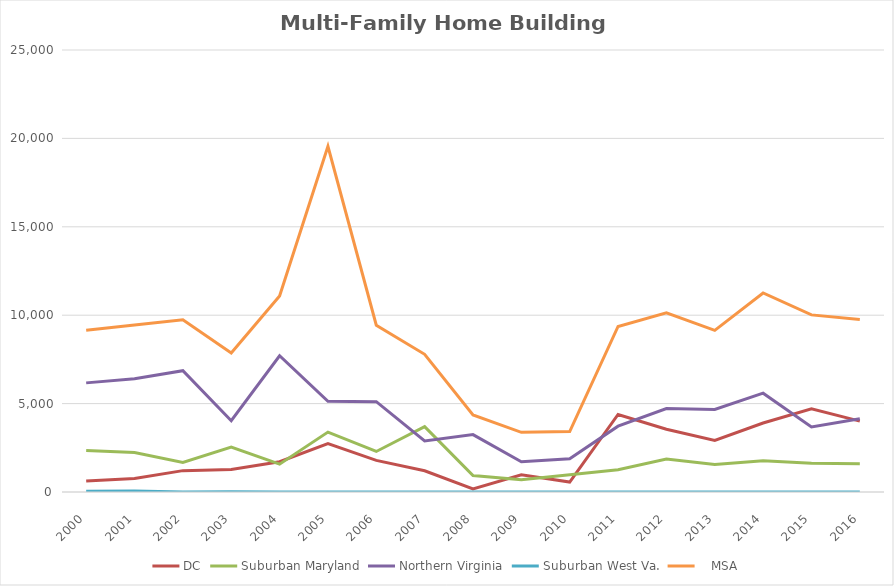
| Category | DC | Suburban Maryland | Northern Virginia | Suburban West Va. |    MSA |
|---|---|---|---|---|---|
| 2000.0 | 619 | 2354 | 6172 | 49 | 9147 |
| 2001.0 | 765 | 2229 | 6411 | 63 | 9441 |
| 2002.0 | 1208 | 1676 | 6860 | 0 | 9744 |
| 2003.0 | 1275 | 2543 | 4031 | 10 | 7861 |
| 2004.0 | 1710 | 1573 | 7705 | 0 | 11084 |
| 2005.0 | 2735 | 3390 | 5131 | 0 | 19553 |
| 2006.0 | 1789 | 2292 | 5111 | 7 | 9434 |
| 2007.0 | 1202 | 3695 | 2891 | 0 | 7788 |
| 2008.0 | 179 | 930 | 3245 | 0 | 4354 |
| 2009.0 | 975 | 694 | 1706 | 0 | 3375 |
| 2010.0 | 562 | 977 | 1882 | 0 | 3421 |
| 2011.0 | 4385 | 1254 | 3722 | 0 | 9361 |
| 2012.0 | 3552 | 1863 | 4720 | 0 | 10135 |
| 2013.0 | 2922 | 1550 | 4673 | 0 | 9145 |
| 2014.0 | 3901 | 1769 | 5589 | 0 | 11259 |
| 2015.0 | 4701 | 1633 | 3680 | 4 | 10018 |
| 2016.0 | 4007 | 1604 | 4141 | 0 | 9752 |